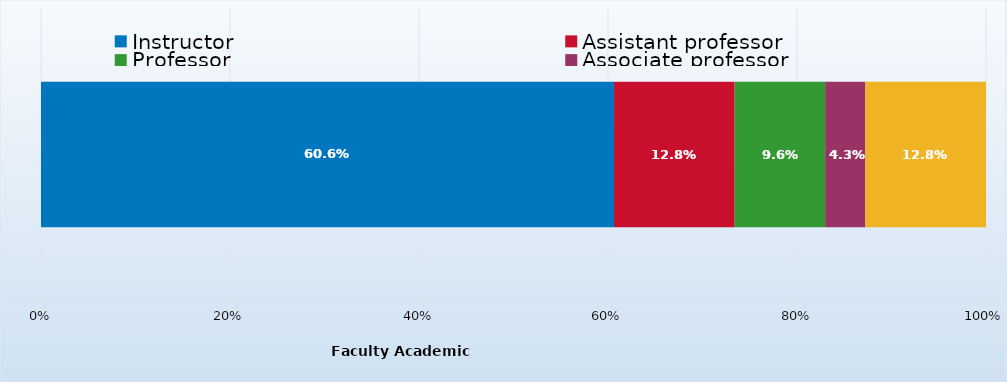
| Category | Instructor | Assistant professor | Professor | Associate professor | Lab technician/Lab associate |
|---|---|---|---|---|---|
| 0 | 0.606 | 0.128 | 0.096 | 0.043 | 0.128 |